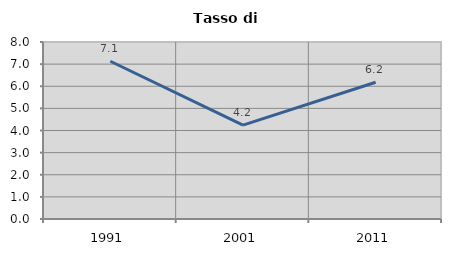
| Category | Tasso di disoccupazione   |
|---|---|
| 1991.0 | 7.13 |
| 2001.0 | 4.246 |
| 2011.0 | 6.179 |